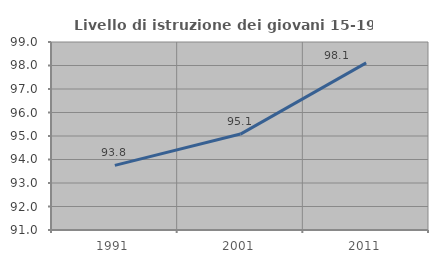
| Category | Livello di istruzione dei giovani 15-19 anni |
|---|---|
| 1991.0 | 93.75 |
| 2001.0 | 95.082 |
| 2011.0 | 98.113 |